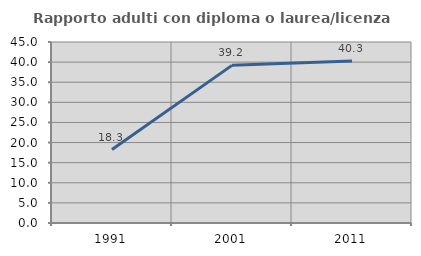
| Category | Rapporto adulti con diploma o laurea/licenza media  |
|---|---|
| 1991.0 | 18.261 |
| 2001.0 | 39.189 |
| 2011.0 | 40.268 |